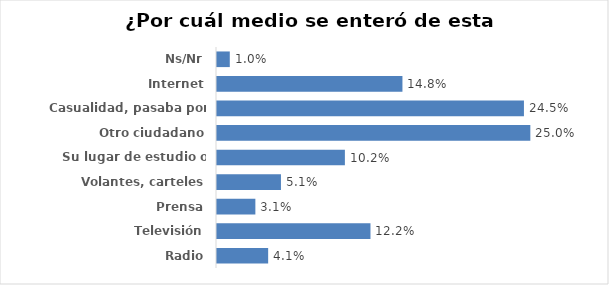
| Category | Series 0 |
|---|---|
| Radio | 0.041 |
| Televisión | 0.122 |
| Prensa | 0.031 |
| Volantes, carteles | 0.051 |
| Su lugar de estudio o trabajo | 0.102 |
| Otro ciudadano | 0.25 |
| Casualidad, pasaba por aquí | 0.245 |
| Internet | 0.148 |
| Ns/Nr | 0.01 |